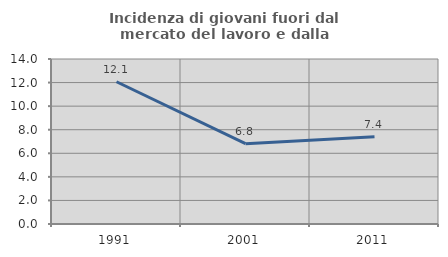
| Category | Incidenza di giovani fuori dal mercato del lavoro e dalla formazione  |
|---|---|
| 1991.0 | 12.069 |
| 2001.0 | 6.818 |
| 2011.0 | 7.407 |